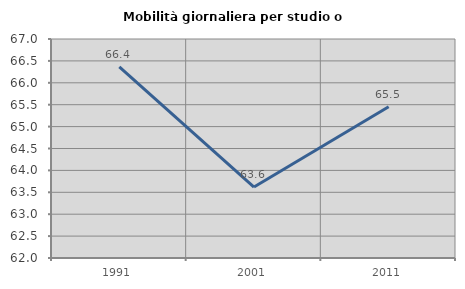
| Category | Mobilità giornaliera per studio o lavoro |
|---|---|
| 1991.0 | 66.362 |
| 2001.0 | 63.62 |
| 2011.0 | 65.453 |